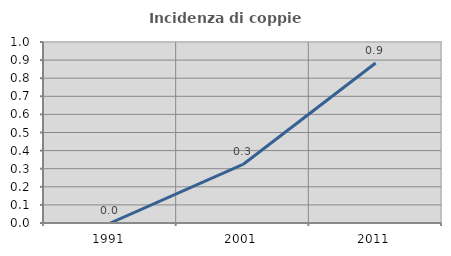
| Category | Incidenza di coppie miste |
|---|---|
| 1991.0 | 0 |
| 2001.0 | 0.323 |
| 2011.0 | 0.884 |